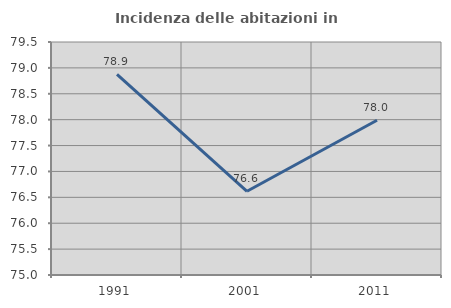
| Category | Incidenza delle abitazioni in proprietà  |
|---|---|
| 1991.0 | 78.875 |
| 2001.0 | 76.617 |
| 2011.0 | 77.989 |